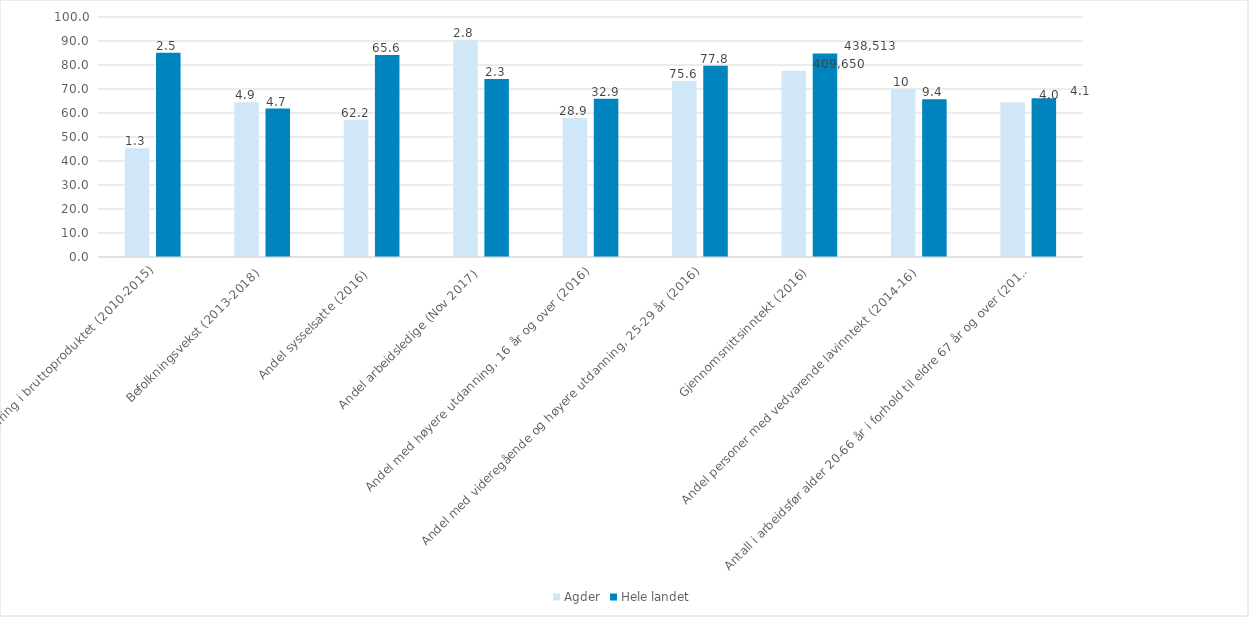
| Category | Agder | Hele landet |
|---|---|---|
| Endring i bruttoproduktet (2010-2015) | 45.267 | 85.077 |
| Befolkningsvekst (2013-2018) | 64.474 | 61.842 |
| Andel sysselsatte (2016) | 57.143 | 84.127 |
| Andel arbeidsledige (Nov 2017) | 90.323 | 74.194 |
| Andel med høyere utdanning, 16 år og over (2016) | 57.916 | 65.932 |
| Andel med videregående og høyere utdanning, 25-29 år (2016) | 73.352 | 79.656 |
| Gjennomsnittsinntekt (2016) | 77.568 | 84.798 |
| Andel personer med vedvarende lavinntekt (2014-16) | 69.93 | 65.734 |
| Antall i arbeidsfør alder 20-66 år i forhold til eldre 67 år og over (2018) | 64.516 | 66.129 |